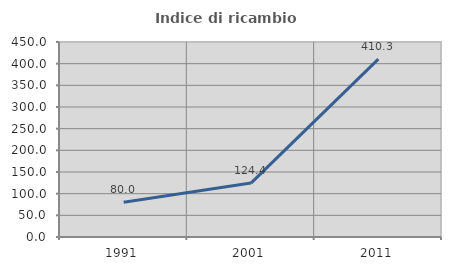
| Category | Indice di ricambio occupazionale  |
|---|---|
| 1991.0 | 80 |
| 2001.0 | 124.444 |
| 2011.0 | 410.309 |